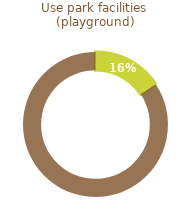
| Category | Use park facilities (playground) |
|---|---|
| 0 | 0.156 |
| 1 | 0.844 |